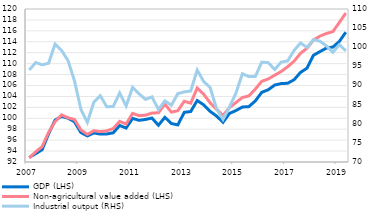
| Category | GDP (LHS) | Non-agricultural value added (LHS) |
|---|---|---|
| 2007 | 92.832 | 92.744 |
| II | 93.521 | 93.866 |
| III | 94.257 | 94.819 |
| IV | 97.157 | 97.429 |
| 2008 | 99.663 | 99.371 |
| II | 100.337 | 100.629 |
| III | 100.028 | 100.098 |
| IV | 99.364 | 99.783 |
| 2009 | 97.387 | 97.87 |
| II | 96.773 | 97.045 |
| III | 97.312 | 97.725 |
| IV | 97.108 | 97.552 |
| 2010 | 97.124 | 97.702 |
| II | 97.347 | 98.131 |
| III | 98.677 | 99.431 |
| IV | 98.217 | 98.944 |
| 2011 | 99.982 | 100.898 |
| II | 99.627 | 100.485 |
| III | 99.788 | 100.568 |
| IV | 100.038 | 100.964 |
| 2012 | 98.726 | 101.005 |
| II | 100.176 | 102.591 |
| III | 99.042 | 101.132 |
| IV | 98.787 | 101.386 |
| 2013 | 101.086 | 103.121 |
| II | 101.241 | 102.762 |
| III | 103.252 | 105.536 |
| IV | 102.468 | 104.401 |
| 2014 | 101.273 | 102.845 |
| II | 100.404 | 101.659 |
| III | 99.274 | 100.528 |
| IV | 100.888 | 101.953 |
| 2015 | 101.416 | 102.889 |
| II | 102.06 | 103.801 |
| III | 102.136 | 104.092 |
| IV | 103.183 | 105.349 |
| 2016 | 104.754 | 106.771 |
| II | 105.218 | 107.195 |
| III | 106.079 | 107.888 |
| IV | 106.354 | 108.566 |
| 2017 | 106.407 | 109.428 |
| II | 107.051 | 110.451 |
| III | 108.4 | 111.893 |
| IV | 109.176 | 112.822 |
| 2018 | 111.531 | 114.338 |
| II | 112.199 | 115.034 |
| III | 112.851 | 115.516 |
| IV | 113.029 | 115.861 |
| 2019 | 114.058 | 117.532 |
| II | 115.746 | 119.256 |